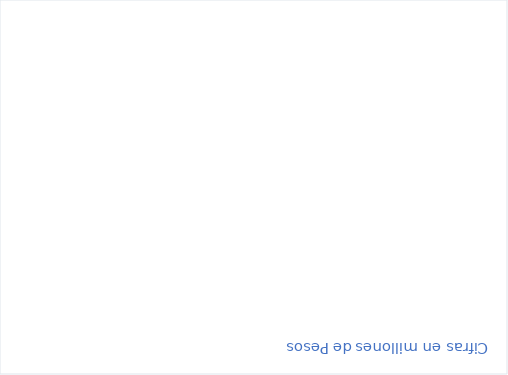
| Category | RESERVAS CONSTITUIDAS
 | CANCELACIONES RESERVAS PRESUPUESTALES
  | PAGOS
ACUMULADOS
 |
|---|---|---|---|
| Total | 55446.915 | 1008.219 | 43601.801 |